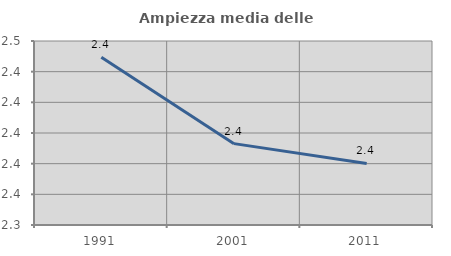
| Category | Ampiezza media delle famiglie |
|---|---|
| 1991.0 | 2.449 |
| 2001.0 | 2.393 |
| 2011.0 | 2.38 |